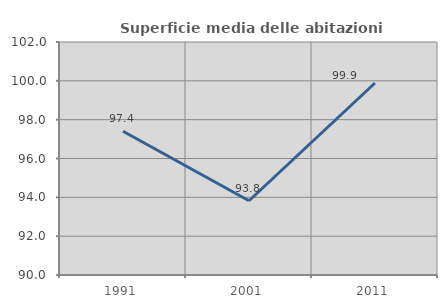
| Category | Superficie media delle abitazioni occupate |
|---|---|
| 1991.0 | 97.403 |
| 2001.0 | 93.823 |
| 2011.0 | 99.888 |